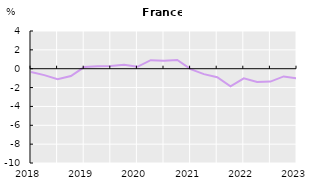
| Category | Basic wage (all sectors) | Basic wage (private sector) | Wage incl. Lump sums and special payments (all sectors) | Wage incl. Lump sums and special payments (private sector) |
|---|---|---|---|---|
| 2018.0 |  | -0.356 |  |  |
| nan |  | -0.682 |  |  |
| nan |  | -1.123 |  |  |
| nan |  | -0.781 |  |  |
| 2019.0 |  | 0.176 |  |  |
| nan |  | 0.273 |  |  |
| nan |  | 0.293 |  |  |
| nan |  | 0.411 |  |  |
| 2020.0 |  | 0.204 |  |  |
| nan |  | 0.9 |  |  |
| nan |  | 0.85 |  |  |
| nan |  | 0.923 |  |  |
| 2021.0 |  | -0.043 |  |  |
| nan |  | -0.574 |  |  |
| nan |  | -0.909 |  |  |
| nan |  | -1.867 |  |  |
| 2022.0 |  | -1.021 |  |  |
| nan |  | -1.414 |  |  |
| nan |  | -1.368 |  |  |
| nan |  | -0.817 |  |  |
| 2023.0 |  | -1.028 |  |  |